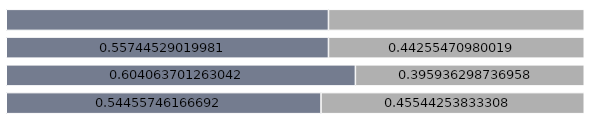
| Category | Männer | Frauen |
|---|---|---|
| 1 | 0.545 | 0.455 |
| 2 | 0.604 | 0.396 |
| 3 | 0.557 | 0.443 |
| 4 | 0.557 | 0.443 |